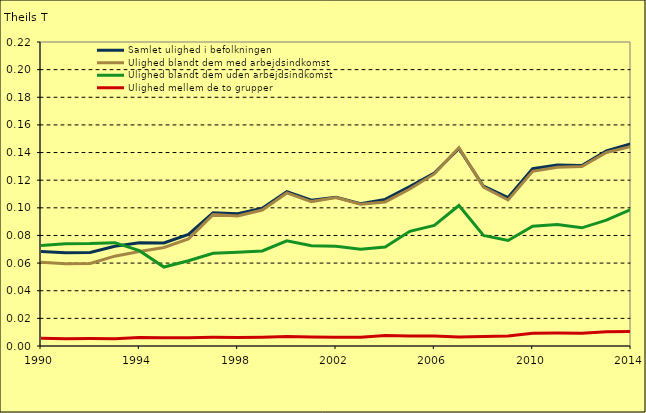
| Category | Samlet ulighed i befolkningen | Ulighed blandt dem med arbejdsindkomst | Ulighed blandt dem uden arbejdsindkomst | Ulighed mellem de to grupper |
|---|---|---|---|---|
| 1990.0 | 0.068 | 0.061 | 0.073 | 0.006 |
| 1991.0 | 0.067 | 0.059 | 0.074 | 0.005 |
| 1992.0 | 0.068 | 0.06 | 0.074 | 0.005 |
| 1993.0 | 0.072 | 0.065 | 0.075 | 0.005 |
| 1994.0 | 0.075 | 0.068 | 0.069 | 0.006 |
| 1995.0 | 0.075 | 0.071 | 0.057 | 0.006 |
| 1996.0 | 0.081 | 0.078 | 0.062 | 0.006 |
| 1997.0 | 0.096 | 0.095 | 0.067 | 0.006 |
| 1998.0 | 0.096 | 0.094 | 0.068 | 0.006 |
| 1999.0 | 0.1 | 0.098 | 0.069 | 0.006 |
| 2000.0 | 0.112 | 0.111 | 0.076 | 0.007 |
| 2001.0 | 0.106 | 0.105 | 0.073 | 0.007 |
| 2002.0 | 0.108 | 0.107 | 0.072 | 0.006 |
| 2003.0 | 0.103 | 0.103 | 0.07 | 0.006 |
| 2004.0 | 0.106 | 0.104 | 0.072 | 0.008 |
| 2005.0 | 0.115 | 0.114 | 0.083 | 0.007 |
| 2006.0 | 0.125 | 0.125 | 0.087 | 0.007 |
| 2007.0 | 0.143 | 0.144 | 0.102 | 0.007 |
| 2008.0 | 0.116 | 0.115 | 0.08 | 0.007 |
| 2009.0 | 0.107 | 0.106 | 0.076 | 0.007 |
| 2010.0 | 0.128 | 0.126 | 0.087 | 0.009 |
| 2011.0 | 0.131 | 0.129 | 0.088 | 0.009 |
| 2012.0 | 0.131 | 0.13 | 0.086 | 0.009 |
| 2013.0 | 0.141 | 0.14 | 0.091 | 0.01 |
| 2014.0 | 0.146 | 0.144 | 0.099 | 0.01 |